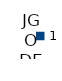
| Category | LUNES | MARTES | MIERCOLES | JUEVES  | VIERNES  | SABADO | DOMINGO |
|---|---|---|---|---|---|---|---|
| 0 | 800 | 3200 | 2400 | 1600 | 4000 | 1600 | 4800 |